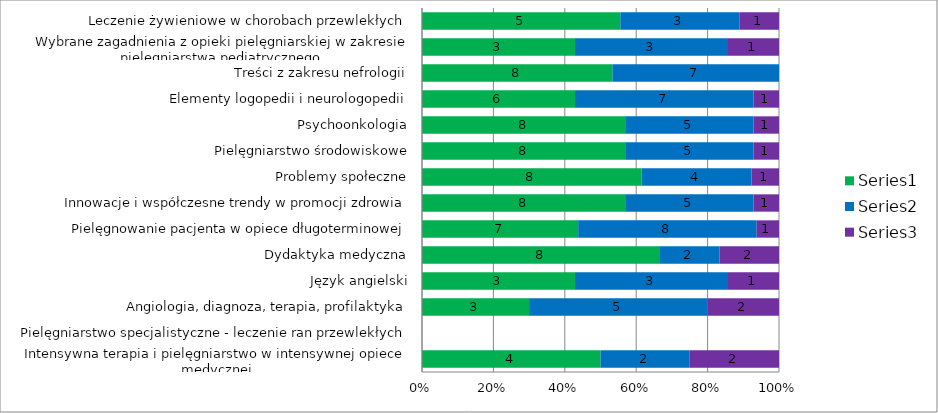
| Category | Series 0 | Series 1 | Series 2 |
|---|---|---|---|
| Intensywna terapia i pielęgniarstwo w intensywnej opiece medycznej | 4 | 2 | 2 |
| Pielęgniarstwo specjalistyczne - leczenie ran przewlekłych | 0 | 0 | 0 |
| Angiologia, diagnoza, terapia, profilaktyka | 3 | 5 | 2 |
| Język angielski | 3 | 3 | 1 |
| Dydaktyka medyczna | 8 | 2 | 2 |
| Pielęgnowanie pacjenta w opiece długoterminowej | 7 | 8 | 1 |
| Innowacje i współczesne trendy w promocji zdrowia | 8 | 5 | 1 |
| Problemy społeczne | 8 | 4 | 1 |
| Pielęgniarstwo środowiskowe | 8 | 5 | 1 |
| Psychoonkologia | 8 | 5 | 1 |
| Elementy logopedii i neurologopedii | 6 | 7 | 1 |
| Treści z zakresu nefrologii | 8 | 7 | 0 |
| Wybrane zagadnienia z opieki pielęgniarskiej w zakresie pielęgniarstwa pediatrycznego | 3 | 3 | 1 |
| Leczenie żywieniowe w chorobach przewlekłych | 5 | 3 | 1 |